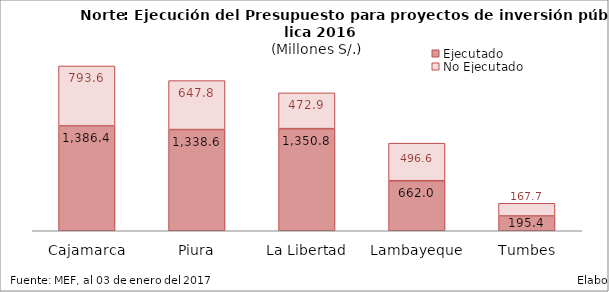
| Category | Ejecutado | No Ejecutado |
|---|---|---|
| Cajamarca | 1386.39 | 793.593 |
| Piura | 1338.625 | 647.81 |
| La Libertad | 1350.765 | 472.921 |
| Lambayeque | 661.986 | 496.599 |
| Tumbes | 195.402 | 167.741 |